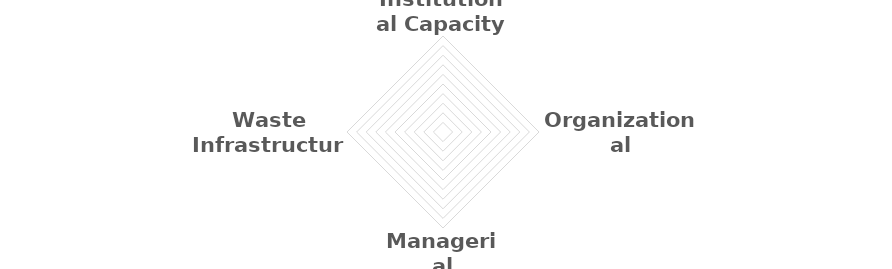
| Category | Series 0 |
|---|---|
| Institutional Capacity | 0 |
| Organizational Arrangements | 0 |
| Managerial Capacity | 0 |
| Waste Infrastructure | 0 |